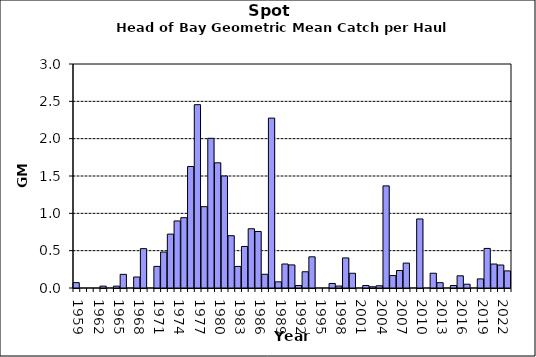
| Category | Series 0 |
|---|---|
| 1959.0 | 0.072 |
| 1960.0 | 0 |
| 1961.0 | 0 |
| 1962.0 | 0 |
| 1963.0 | 0.025 |
| 1964.0 | 0 |
| 1965.0 | 0.025 |
| 1966.0 | 0.183 |
| 1967.0 | 0 |
| 1968.0 | 0.147 |
| 1969.0 | 0.527 |
| 1970.0 | 0 |
| 1971.0 | 0.289 |
| 1972.0 | 0.482 |
| 1973.0 | 0.722 |
| 1974.0 | 0.898 |
| 1975.0 | 0.942 |
| 1976.0 | 1.627 |
| 1977.0 | 2.455 |
| 1978.0 | 1.089 |
| 1979.0 | 2.005 |
| 1980.0 | 1.677 |
| 1981.0 | 1.5 |
| 1982.0 | 0.7 |
| 1983.0 | 0.289 |
| 1984.0 | 0.556 |
| 1985.0 | 0.793 |
| 1986.0 | 0.757 |
| 1987.0 | 0.184 |
| 1988.0 | 2.276 |
| 1989.0 | 0.083 |
| 1990.0 | 0.321 |
| 1991.0 | 0.309 |
| 1992.0 | 0.034 |
| 1993.0 | 0.218 |
| 1994.0 | 0.418 |
| 1995.0 | 0 |
| 1996.0 | 0 |
| 1997.0 | 0.061 |
| 1998.0 | 0.027 |
| 1999.0 | 0.403 |
| 2000.0 | 0.197 |
| 2001.0 | 0 |
| 2002.0 | 0.034 |
| 2003.0 | 0.017 |
| 2004.0 | 0.03 |
| 2005.0 | 1.368 |
| 2006.0 | 0.167 |
| 2007.0 | 0.234 |
| 2008.0 | 0.333 |
| 2009.0 | 0 |
| 2010.0 | 0.925 |
| 2011.0 | 0 |
| 2012.0 | 0.198 |
| 2013.0 | 0.071 |
| 2014.0 | 0 |
| 2015.0 | 0.034 |
| 2016.0 | 0.163 |
| 2017.0 | 0.051 |
| 2018.0 | 0 |
| 2019.0 | 0.122 |
| 2020.0 | 0.53 |
| 2021.0 | 0.321 |
| 2022.0 | 0.308 |
| 2023.0 | 0.229 |